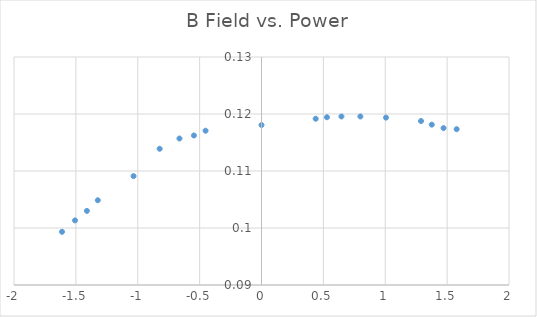
| Category | Series 0 |
|---|---|
| 0.438 | 0.119 |
| 0.529 | 0.119 |
| 0.646 | 0.12 |
| 0.799 | 0.12 |
| 1.006 | 0.119 |
| 1.289 | 0.119 |
| 1.376 | 0.118 |
| 1.471 | 0.118 |
| 1.577 | 0.117 |
| -0.452 | 0.117 |
| -0.546 | 0.116 |
| -0.663 | 0.116 |
| -0.823 | 0.114 |
| -1.034 | 0.109 |
| -1.323 | 0.105 |
| -1.411 | 0.103 |
| -1.507 | 0.101 |
| -1.612 | 0.099 |
| 0.0 | 0.118 |